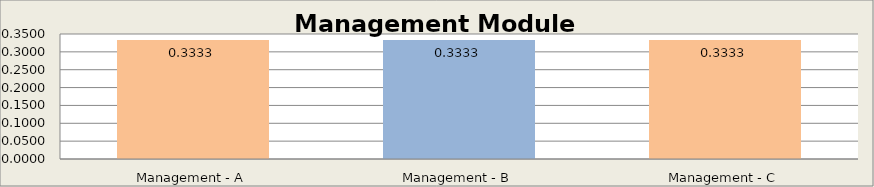
| Category | Management Module |
|---|---|
| Management - A | 0.333 |
| Management - B | 0.333 |
| Management - C | 0.333 |